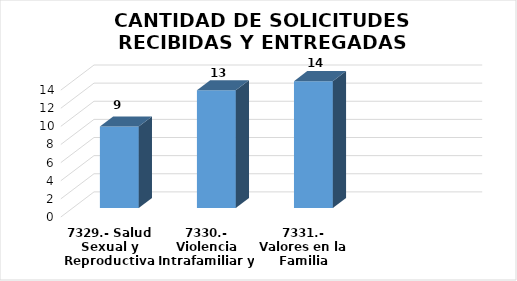
| Category | SOLICITUDES |
|---|---|
| 7329.- Salud Sexual y Reproductiva | 9 |
| 7330.- Violencia Intrafamiliar y de Género | 13 |
| 7331.- Valores en la Familia | 14 |